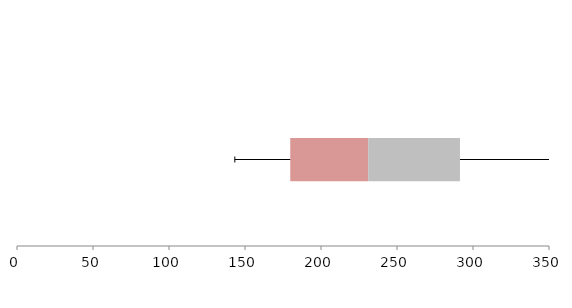
| Category | Series 1 | Series 2 | Series 3 |
|---|---|---|---|
| 0 | 179.77 | 51.288 | 60.36 |